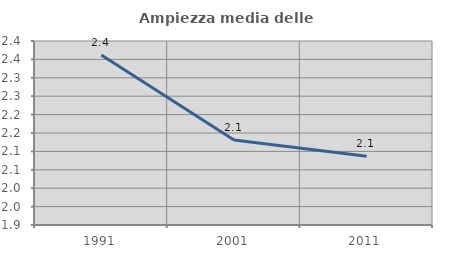
| Category | Ampiezza media delle famiglie |
|---|---|
| 1991.0 | 2.362 |
| 2001.0 | 2.131 |
| 2011.0 | 2.087 |